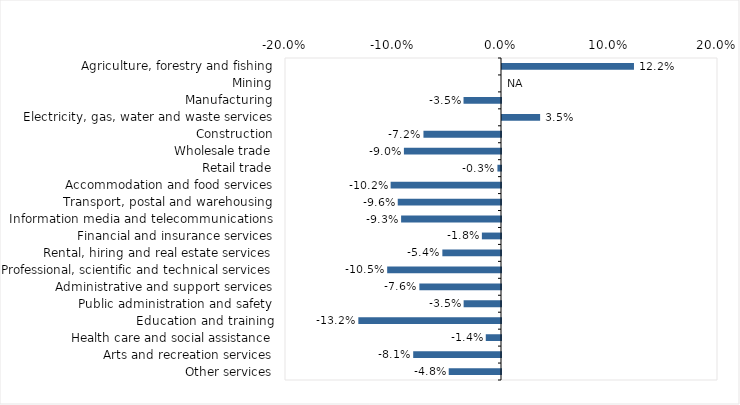
| Category | This week |
|---|---|
| Agriculture, forestry and fishing | 0.122 |
| Mining | 0 |
| Manufacturing | -0.035 |
| Electricity, gas, water and waste services | 0.035 |
| Construction | -0.072 |
| Wholesale trade | -0.09 |
| Retail trade | -0.003 |
| Accommodation and food services | -0.102 |
| Transport, postal and warehousing | -0.096 |
| Information media and telecommunications | -0.092 |
| Financial and insurance services | -0.018 |
| Rental, hiring and real estate services | -0.054 |
| Professional, scientific and technical services | -0.105 |
| Administrative and support services | -0.076 |
| Public administration and safety | -0.035 |
| Education and training | -0.132 |
| Health care and social assistance | -0.014 |
| Arts and recreation services | -0.081 |
| Other services | -0.048 |